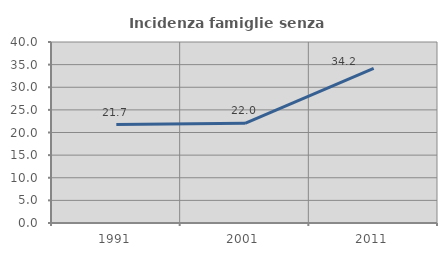
| Category | Incidenza famiglie senza nuclei |
|---|---|
| 1991.0 | 21.745 |
| 2001.0 | 22.034 |
| 2011.0 | 34.176 |